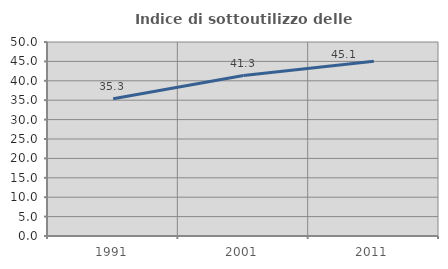
| Category | Indice di sottoutilizzo delle abitazioni  |
|---|---|
| 1991.0 | 35.348 |
| 2001.0 | 41.347 |
| 2011.0 | 45.066 |